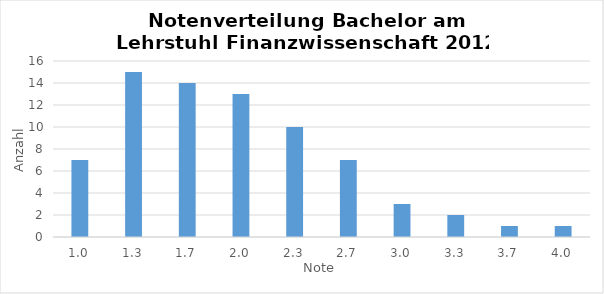
| Category | Häufigkeit |
|---|---|
| 1.0 | 7 |
| 1.3 | 15 |
| 1.7 | 14 |
| 2.0 | 13 |
| 2.3 | 10 |
| 2.7 | 7 |
| 3.0 | 3 |
| 3.3 | 2 |
| 3.7 | 1 |
| 4.0 | 1 |